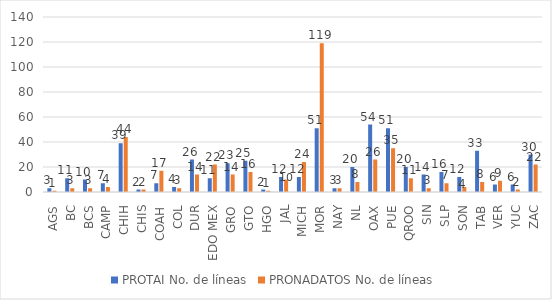
| Category | PROTAI No. de líneas | PRONADATOS No. de líneas |
|---|---|---|
| AGS | 3 | 1 |
| BC | 11 | 3 |
| BCS | 10 | 3 |
| CAMP | 7 | 4 |
| CHIH | 39 | 44 |
| CHIS | 2 | 2 |
| COAH | 7 | 17 |
| COL | 4 | 3 |
| DUR | 26 | 14 |
| EDO MEX | 11 | 22 |
| GRO | 23 | 14 |
| GTO | 25 | 16 |
| HGO | 2 | 1 |
| JAL | 12 | 10 |
| MICH | 12 | 24 |
| MOR | 51 | 119 |
| NAY | 3 | 3 |
| NL | 20 | 8 |
| OAX | 54 | 26 |
| PUE | 51 | 35 |
| QROO | 20 | 11 |
| SIN | 14 | 3 |
| SLP | 16 | 7 |
| SON | 12 | 4 |
| TAB | 33 | 8 |
| VER | 6 | 9 |
| YUC | 6 | 2 |
| ZAC | 30 | 22 |